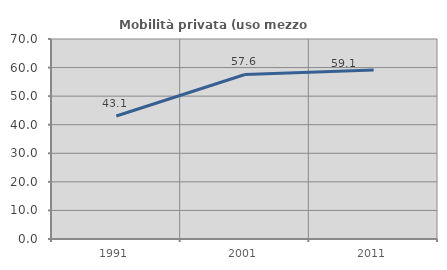
| Category | Mobilità privata (uso mezzo privato) |
|---|---|
| 1991.0 | 43.064 |
| 2001.0 | 57.579 |
| 2011.0 | 59.124 |